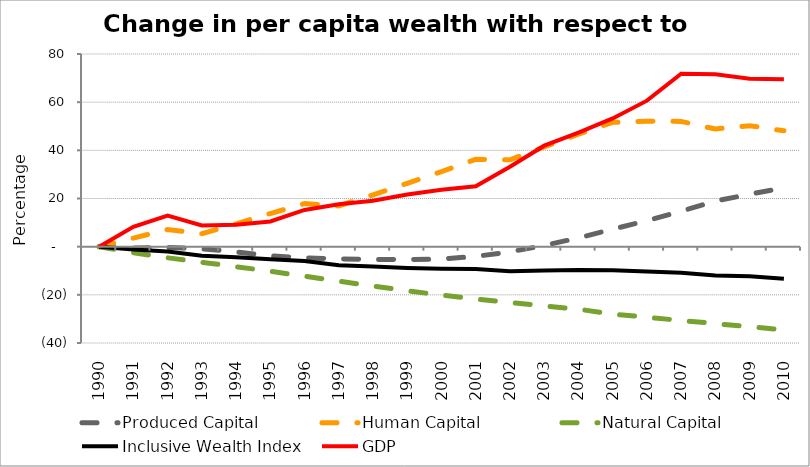
| Category | Produced Capital  | Human Capital | Natural Capital | Inclusive Wealth Index | GDP |
|---|---|---|---|---|---|
| 1990.0 | 0 | 0 | 0 | 0 | 0 |
| 1991.0 | -0.518 | 3.562 | -2.508 | -1.194 | 8.263 |
| 1992.0 | -0.348 | 7.119 | -4.612 | -2.03 | 12.864 |
| 1993.0 | -0.836 | 5.393 | -6.48 | -3.729 | 8.838 |
| 1994.0 | -2.196 | 9.504 | -8.315 | -4.43 | 9.081 |
| 1995.0 | -3.829 | 13.763 | -10.222 | -5.185 | 10.471 |
| 1996.0 | -4.651 | 17.883 | -12.233 | -5.954 | 15.239 |
| 1997.0 | -5.034 | 16.902 | -14.326 | -7.667 | 17.604 |
| 1998.0 | -5.347 | 21.548 | -16.334 | -8.285 | 19.102 |
| 1999.0 | -5.367 | 26.287 | -18.307 | -8.832 | 21.651 |
| 2000.0 | -5.117 | 31.14 | -20.117 | -9.213 | 23.619 |
| 2001.0 | -4.044 | 36.287 | -21.704 | -9.296 | 25.106 |
| 2002.0 | -2.15 | 36.073 | -23.172 | -10.185 | 33.215 |
| 2003.0 | 0.49 | 41.429 | -24.581 | -9.94 | 41.935 |
| 2004.0 | 3.639 | 46.688 | -25.966 | -9.643 | 47.356 |
| 2005.0 | 7.243 | 51.65 | -27.961 | -9.788 | 53.233 |
| 2006.0 | 10.813 | 52.051 | -29.322 | -10.315 | 60.629 |
| 2007.0 | 14.693 | 52.022 | -30.646 | -10.862 | 71.837 |
| 2008.0 | 18.943 | 48.855 | -31.957 | -11.933 | 71.569 |
| 2009.0 | 21.763 | 50.233 | -33.255 | -12.316 | 69.696 |
| 2010.0 | 24.428 | 48.095 | -34.525 | -13.335 | 69.502 |